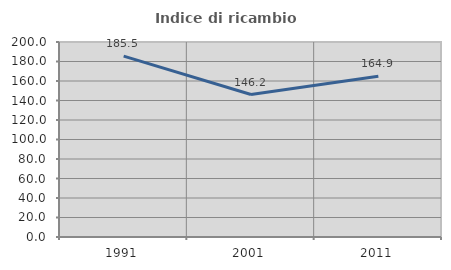
| Category | Indice di ricambio occupazionale  |
|---|---|
| 1991.0 | 185.542 |
| 2001.0 | 146.154 |
| 2011.0 | 164.865 |